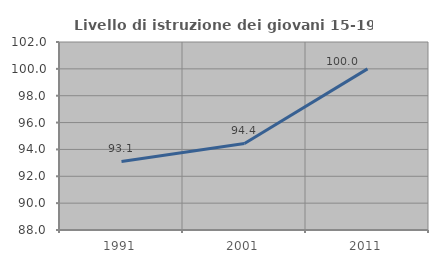
| Category | Livello di istruzione dei giovani 15-19 anni |
|---|---|
| 1991.0 | 93.103 |
| 2001.0 | 94.444 |
| 2011.0 | 100 |